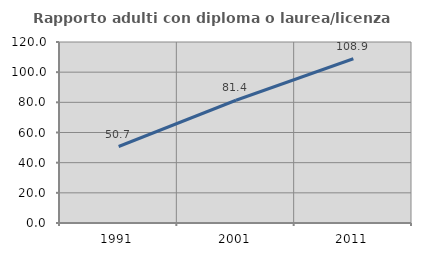
| Category | Rapporto adulti con diploma o laurea/licenza media  |
|---|---|
| 1991.0 | 50.716 |
| 2001.0 | 81.372 |
| 2011.0 | 108.913 |